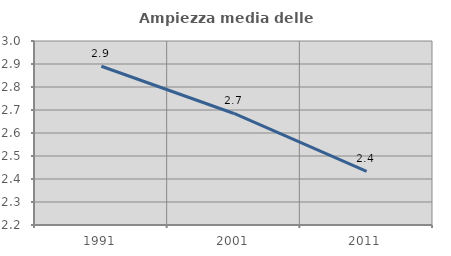
| Category | Ampiezza media delle famiglie |
|---|---|
| 1991.0 | 2.89 |
| 2001.0 | 2.685 |
| 2011.0 | 2.433 |